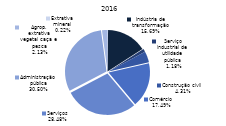
| Category | 2016 |
|---|---|
| Extrativa mineral | 1060 |
| Indústria de transformação | 76939 |
| Serviço industrial de utilidade pública | 5763 |
| Construção civil | 21149 |
| Comércio | 85748 |
| Serviços | 139642 |
| Administração pública | 149529 |
| Agrop. extrativa vegetal caça e pesca | 10442 |